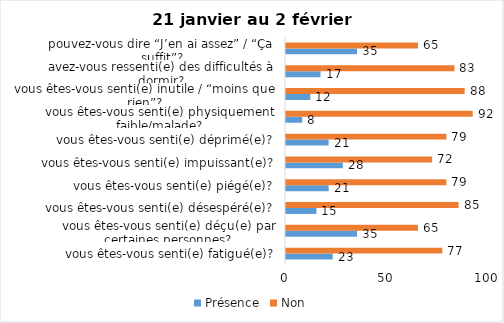
| Category | Présence | Non |
|---|---|---|
| vous êtes-vous senti(e) fatigué(e)? | 23 | 77 |
| vous êtes-vous senti(e) déçu(e) par certaines personnes? | 35 | 65 |
| vous êtes-vous senti(e) désespéré(e)? | 15 | 85 |
| vous êtes-vous senti(e) piégé(e)? | 21 | 79 |
| vous êtes-vous senti(e) impuissant(e)? | 28 | 72 |
| vous êtes-vous senti(e) déprimé(e)? | 21 | 79 |
| vous êtes-vous senti(e) physiquement faible/malade? | 8 | 92 |
| vous êtes-vous senti(e) inutile / “moins que rien”? | 12 | 88 |
| avez-vous ressenti(e) des difficultés à dormir? | 17 | 83 |
| pouvez-vous dire “J’en ai assez” / “Ça suffit”? | 35 | 65 |